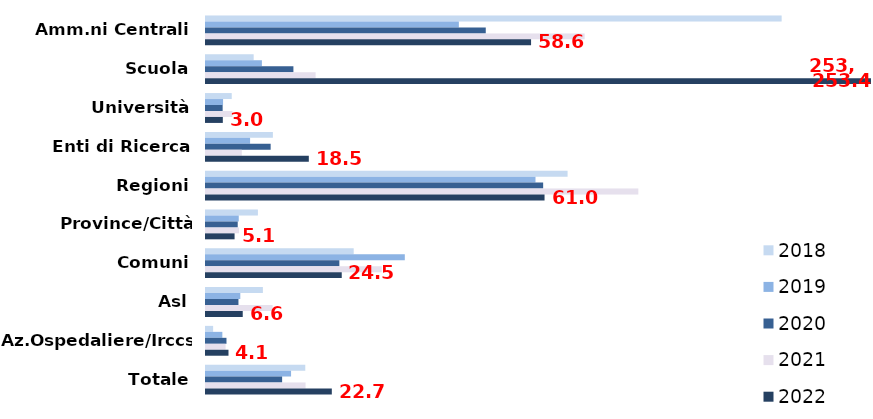
| Category | 2018 | 2019 | 2020 | 2021 | 2022 |
|---|---|---|---|---|---|
| Amm.ni Centrali | 103.72 | 45.56 | 50.407 | 68.222 | 58.571 |
| Scuola | 8.588 | 10.071 | 15.75 | 19.75 | 253.389 |
| Università | 4.636 | 3.077 | 3 | 4.758 | 3.03 |
| Enti di Ricerca | 12.053 | 7.944 | 11.65 | 6.45 | 18.526 |
| Regioni | 65.15 | 59.368 | 60.75 | 77.895 | 61 |
| Province/Città Metrop. | 9.353 | 5.901 | 5.716 | 5.96 | 5.149 |
| Comuni | 26.613 | 35.822 | 24.028 | 31.654 | 24.458 |
| Asl | 10.248 | 6.18 | 5.847 | 12 | 6.619 |
| Az.Ospedaliere/Irccs | 1.284 | 2.946 | 3.689 | 3.526 | 4.053 |
| Totale | 17.891 | 15.327 | 13.716 | 17.94 | 22.669 |